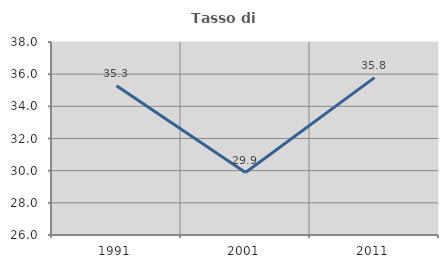
| Category | Tasso di occupazione   |
|---|---|
| 1991.0 | 35.277 |
| 2001.0 | 29.885 |
| 2011.0 | 35.786 |